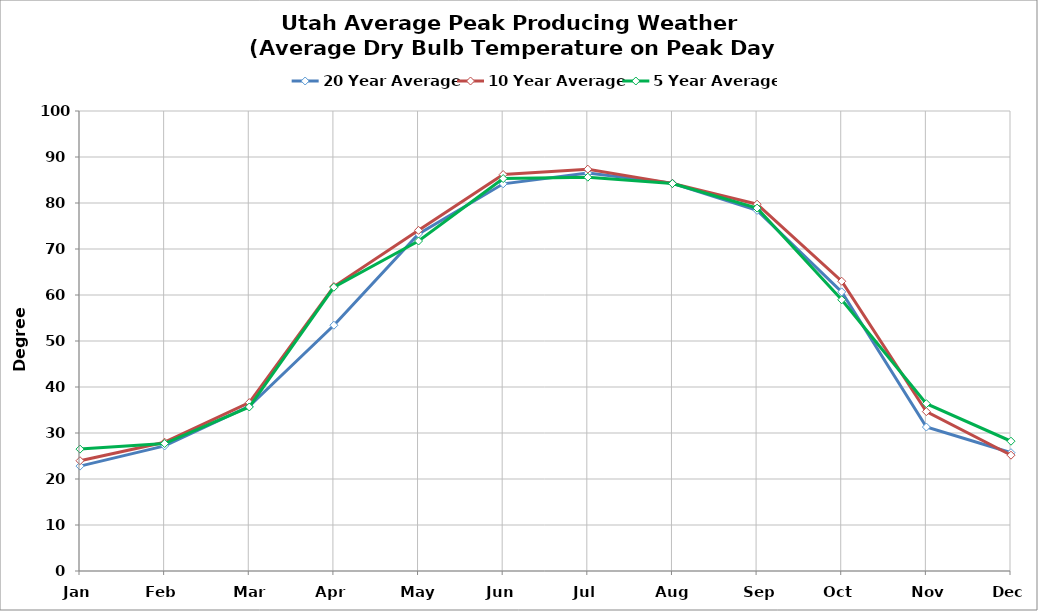
| Category | 20 Year | 10 Year | 5 Year |
|---|---|---|---|
| Jan | 22.8 | 23.972 | 26.496 |
| Feb | 27.188 | 27.995 | 27.712 |
| Mar | 35.795 | 36.604 | 35.654 |
| Apr | 53.432 | 61.852 | 61.682 |
| May | 73.281 | 74.058 | 71.738 |
| Jun | 84.168 | 86.184 | 85.314 |
| Jul | 86.518 | 87.358 | 85.612 |
| Aug | 84.286 | 84.271 | 84.222 |
| Sep | 78.389 | 79.736 | 78.894 |
| Oct | 60.676 | 62.987 | 58.954 |
| Nov | 31.295 | 34.652 | 36.374 |
| Dec | 25.724 | 25.179 | 28.22 |